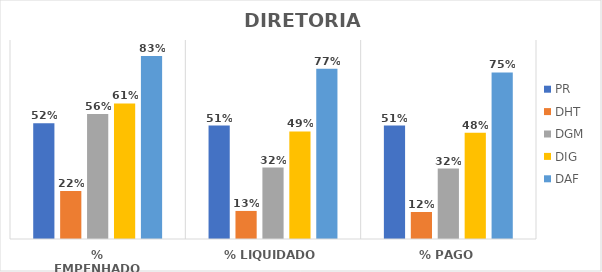
| Category | PR | DHT | DGM | DIG | DAF |
|---|---|---|---|---|---|
| % EMPENHADO | 0.523 | 0.217 | 0.565 | 0.613 | 0.828 |
| % LIQUIDADO | 0.513 | 0.127 | 0.323 | 0.487 | 0.77 |
| % PAGO | 0.513 | 0.122 | 0.319 | 0.48 | 0.754 |